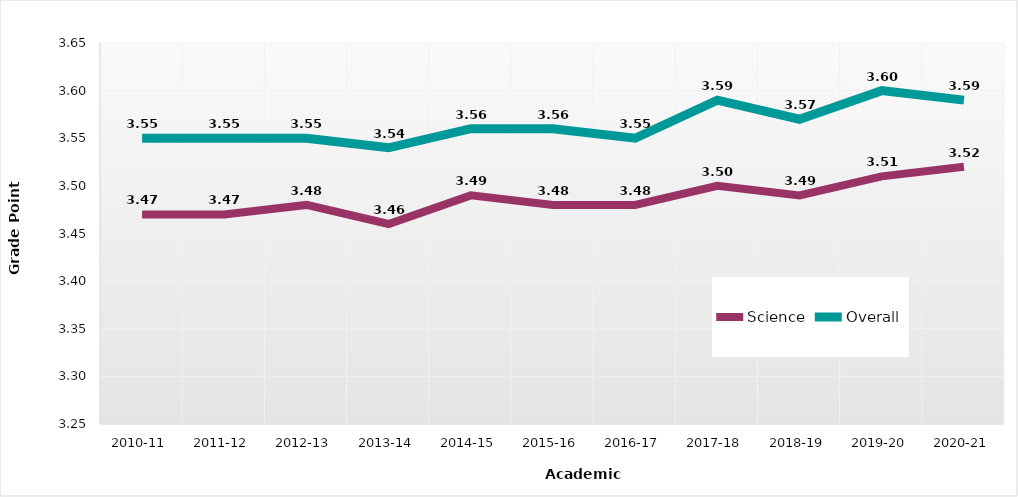
| Category | Science | Overall |
|---|---|---|
| 2010-11 | 3.47 | 3.55 |
| 2011-12 | 3.47 | 3.55 |
| 2012-13 | 3.48 | 3.55 |
| 2013-14 | 3.46 | 3.54 |
| 2014-15 | 3.49 | 3.56 |
| 2015-16 | 3.48 | 3.56 |
| 2016-17 | 3.48 | 3.55 |
| 2017-18 | 3.5 | 3.59 |
| 2018-19 | 3.49 | 3.57 |
| 2019-20 | 3.51 | 3.6 |
| 2020-21 | 3.52 | 3.59 |